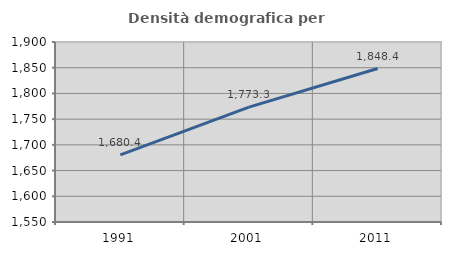
| Category | Densità demografica |
|---|---|
| 1991.0 | 1680.384 |
| 2001.0 | 1773.312 |
| 2011.0 | 1848.449 |